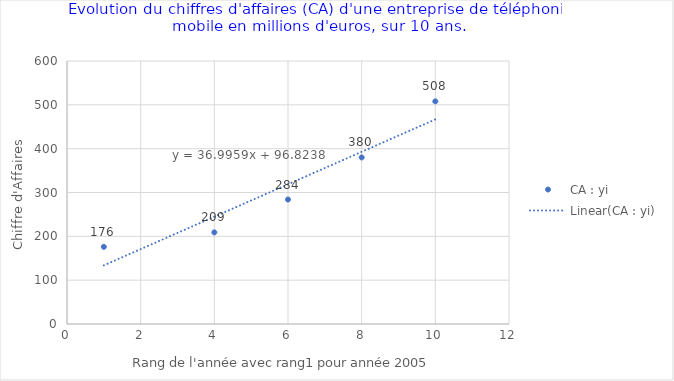
| Category | CA : yi |
|---|---|
| 1.0 | 176 |
| 4.0 | 209 |
| 6.0 | 284 |
| 8.0 | 380 |
| 10.0 | 508 |